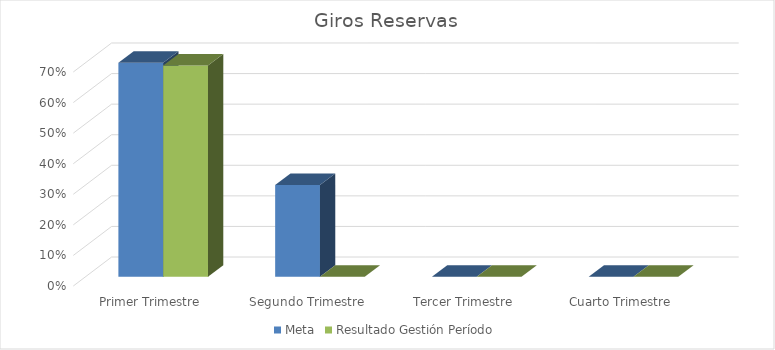
| Category | Meta | Resultado Gestión Período |
|---|---|---|
| Primer Trimestre | 0.7 | 0.691 |
| Segundo Trimestre | 0.3 | 0 |
| Tercer Trimestre | 0 | 0 |
| Cuarto Trimestre | 0 | 0 |